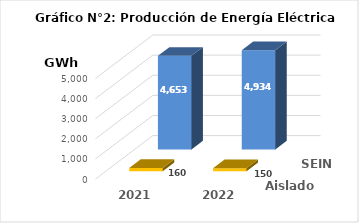
| Category | Aislados | SEIN |
|---|---|---|
| 2021.0 | 159.586 | 4653.157 |
| 2022.0 | 150.161 | 4934.407 |